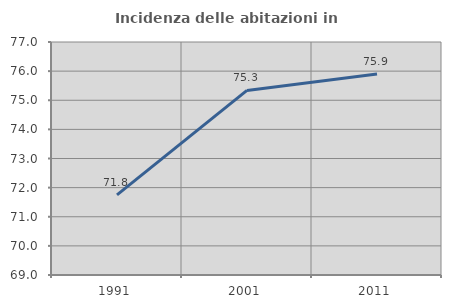
| Category | Incidenza delle abitazioni in proprietà  |
|---|---|
| 1991.0 | 71.753 |
| 2001.0 | 75.336 |
| 2011.0 | 75.902 |